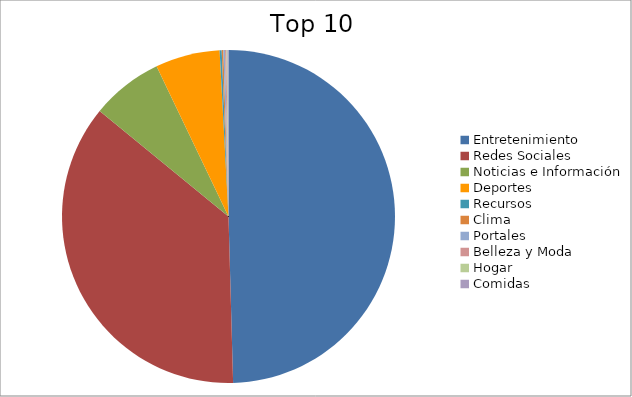
| Category | Series 0 |
|---|---|
| Entretenimiento | 49.48 |
| Redes Sociales | 36.3 |
| Noticias e Información | 6.96 |
| Deportes | 6.25 |
| Recursos | 0.2 |
| Clima | 0.16 |
| Portales | 0.16 |
| Belleza y Moda | 0.13 |
| Hogar | 0.1 |
| Comidas | 0.1 |